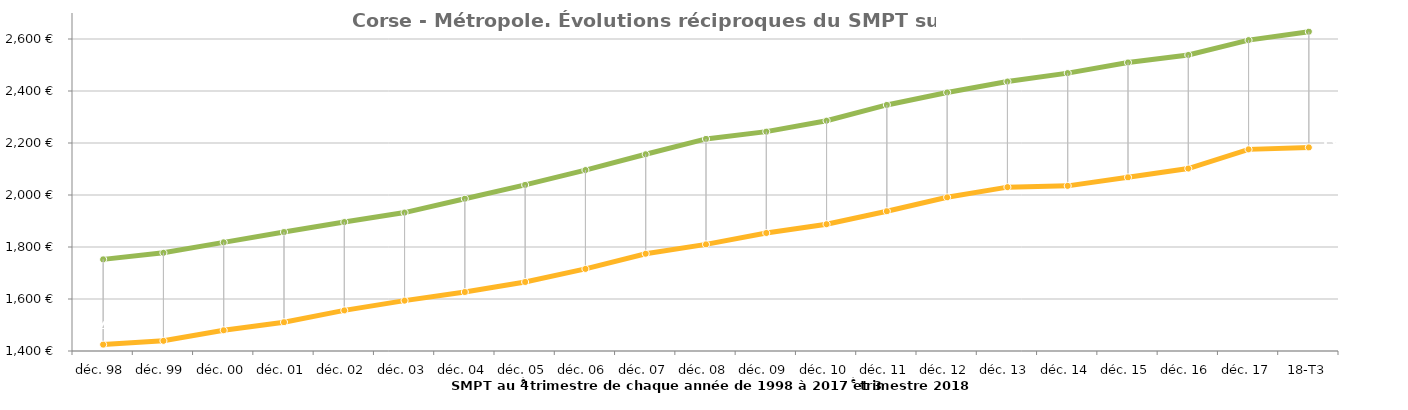
| Category | Métropole | Corse |
|---|---|---|
| déc. 98 | 1752.457 | 1424.55 |
| déc. 99 | 1777.68 | 1439.133 |
| déc. 00 | 1817.905 | 1479.648 |
| déc. 01 | 1857.53 | 1510.837 |
| déc. 02 | 1895.93 | 1556.146 |
| déc. 03 | 1932.341 | 1593.799 |
| déc. 04 | 1985.673 | 1626.847 |
| déc. 05 | 2038.862 | 1665.49 |
| déc. 06 | 2095.944 | 1715.761 |
| déc. 07 | 2156.605 | 1774.185 |
| déc. 08 | 2215.739 | 1810.161 |
| déc. 09 | 2243.648 | 1853.931 |
| déc. 10 | 2285.815 | 1887.63 |
| déc. 11 | 2346.43 | 1937.551 |
| déc. 12 | 2394.379 | 1991.155 |
| déc. 13 | 2436.332 | 2030.178 |
| déc. 14 | 2468.779 | 2035.165 |
| déc. 15 | 2509.785 | 2068.087 |
| déc. 16 | 2538.589 | 2101.818 |
| déc. 17 | 2595.596 | 2175.497 |
| 18-T3 | 2628 | 2183 |